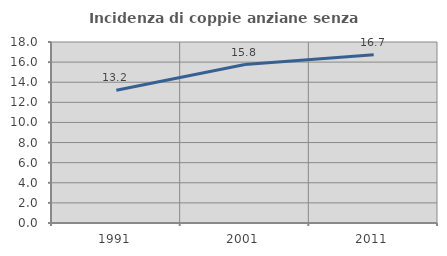
| Category | Incidenza di coppie anziane senza figli  |
|---|---|
| 1991.0 | 13.207 |
| 2001.0 | 15.755 |
| 2011.0 | 16.726 |